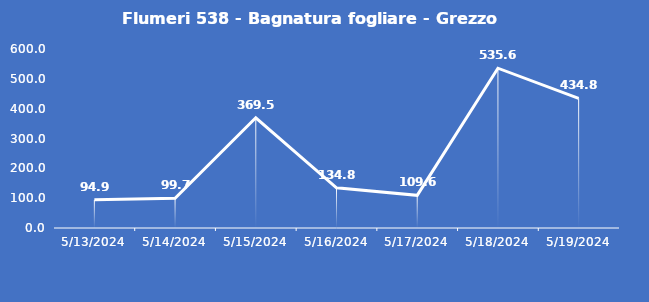
| Category | Flumeri 538 - Bagnatura fogliare - Grezzo (min) |
|---|---|
| 5/13/24 | 94.9 |
| 5/14/24 | 99.7 |
| 5/15/24 | 369.5 |
| 5/16/24 | 134.8 |
| 5/17/24 | 109.6 |
| 5/18/24 | 535.6 |
| 5/19/24 | 434.8 |